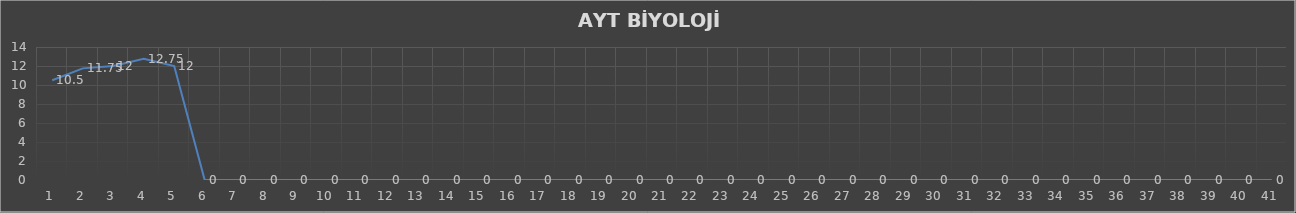
| Category | Series 0 |
|---|---|
| 0 | 10.5 |
| 1 | 11.75 |
| 2 | 12 |
| 3 | 12.75 |
| 4 | 12 |
| 5 | 0 |
| 6 | 0 |
| 7 | 0 |
| 8 | 0 |
| 9 | 0 |
| 10 | 0 |
| 11 | 0 |
| 12 | 0 |
| 13 | 0 |
| 14 | 0 |
| 15 | 0 |
| 16 | 0 |
| 17 | 0 |
| 18 | 0 |
| 19 | 0 |
| 20 | 0 |
| 21 | 0 |
| 22 | 0 |
| 23 | 0 |
| 24 | 0 |
| 25 | 0 |
| 26 | 0 |
| 27 | 0 |
| 28 | 0 |
| 29 | 0 |
| 30 | 0 |
| 31 | 0 |
| 32 | 0 |
| 33 | 0 |
| 34 | 0 |
| 35 | 0 |
| 36 | 0 |
| 37 | 0 |
| 38 | 0 |
| 39 | 0 |
| 40 | 0 |